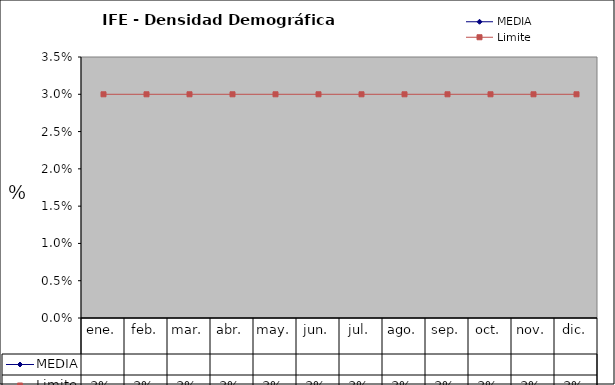
| Category | MEDIA | Limite |
|---|---|---|
| ene. |  | 0.03 |
| feb. |  | 0.03 |
| mar. |  | 0.03 |
| abr. |  | 0.03 |
| may. |  | 0.03 |
| jun. |  | 0.03 |
| jul. |  | 0.03 |
| ago. |  | 0.03 |
| sep. |  | 0.03 |
| oct. |  | 0.03 |
| nov. |  | 0.03 |
| dic. |  | 0.03 |